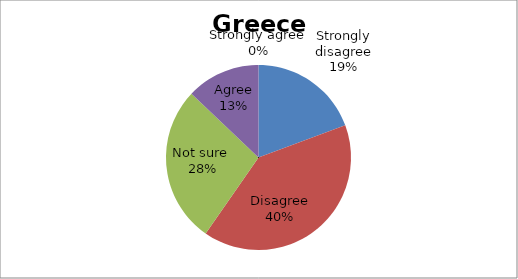
| Category | Series 0 |
|---|---|
| Strongly disagree | 12 |
| Disagree | 25 |
| Not sure  | 17 |
| Agree | 8 |
| Strongly agree | 0 |